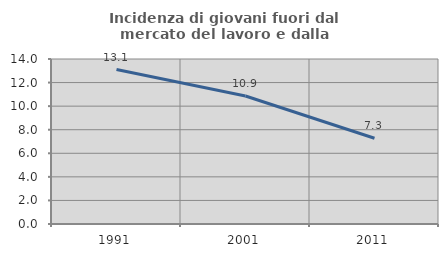
| Category | Incidenza di giovani fuori dal mercato del lavoro e dalla formazione  |
|---|---|
| 1991.0 | 13.104 |
| 2001.0 | 10.863 |
| 2011.0 | 7.273 |